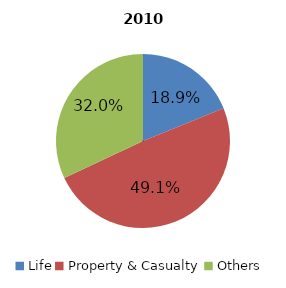
| Category | 2010 |
|---|---|
| Life | 208670192 |
| Property & Casualty | 543672142 |
| Others | 354144048 |